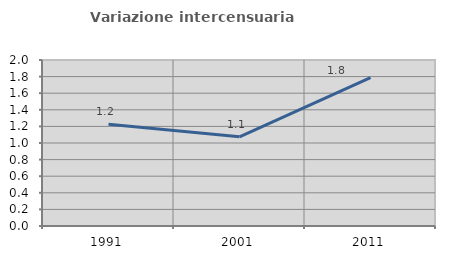
| Category | Variazione intercensuaria annua |
|---|---|
| 1991.0 | 1.227 |
| 2001.0 | 1.075 |
| 2011.0 | 1.787 |